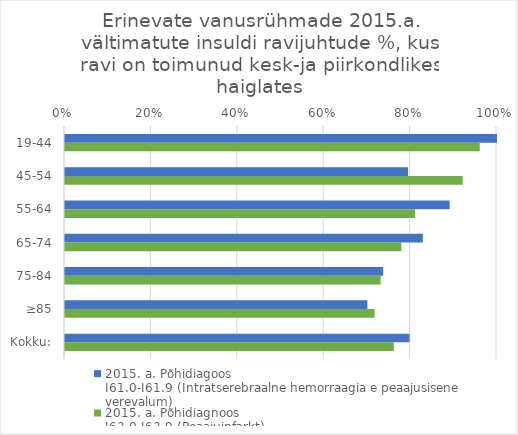
| Category | 2015. a. Põhidiagoos 
I61.0-I61.9 (Intratserebraalne hemorraagia e peaajusisene verevalum) | 2015. a. Põhidiagnoos
I63.0-I63.9 (Peaajuinfarkt) |
|---|---|---|
| 19-44 | 1 | 0.96 |
| 45-54 | 0.794 | 0.921 |
| 55-64 | 0.89 | 0.81 |
| 65-74 | 0.828 | 0.779 |
| 75-84 | 0.736 | 0.731 |
| ≥85 | 0.7 | 0.717 |
| Kokku: | 0.798 | 0.761 |